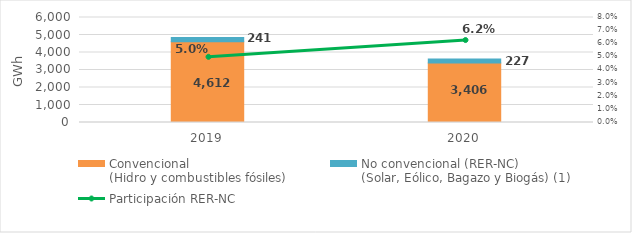
| Category | Convencional
(Hidro y combustibles fósiles) | No convencional (RER-NC)
(Solar, Eólico, Bagazo y Biogás) (1) |
|---|---|---|
| 2019.0 | 4611.526 | 240.944 |
| 2020.0 | 3406.274 | 226.882 |